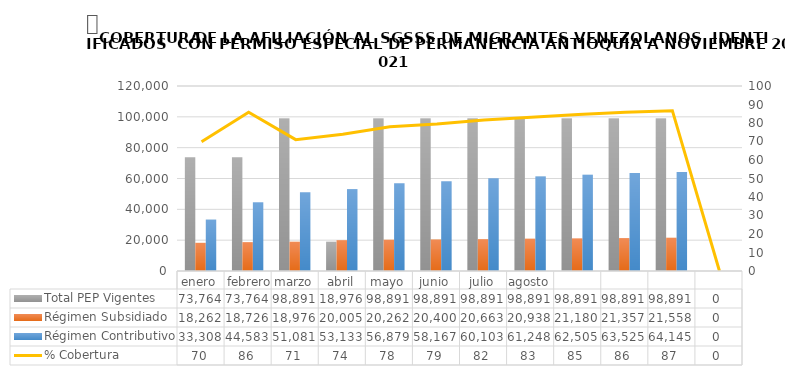
| Category | Total PEP Vigentes | Régimen Subsidiado | Régimen Contributivo |
|---|---|---|---|
| enero | 73764 | 18262 | 33308 |
| febrero | 73764 | 18726 | 44583 |
| marzo | 98891 | 18976 | 51081 |
| abril | 18976 | 20005 | 53133 |
| mayo | 98891 | 20262 | 56879 |
| junio | 98891 | 20400 | 58167 |
| julio | 98891 | 20663 | 60103 |
| agosto | 98891 | 20938 | 61248 |